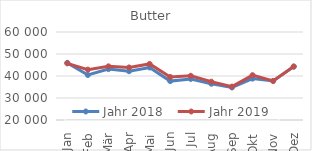
| Category | Jahr 2018 | Jahr 2019 |
|---|---|---|
| Jan | 45980.995 | 45749.808 |
| Feb | 40452.608 | 42898.561 |
| Mär | 43126.294 | 44387.031 |
| Apr | 42172.841 | 43894.582 |
| Mai | 43877.065 | 45481.346 |
| Jun | 37675.276 | 39548.014 |
| Jul | 38668.3 | 40097.604 |
| Aug | 36476.147 | 37423.749 |
| Sep | 34787.986 | 35188.358 |
| Okt | 38814.664 | 40380.144 |
| Nov | 37752.865 | 37745.336 |
| Dez | 44262.335 | 44314.595 |